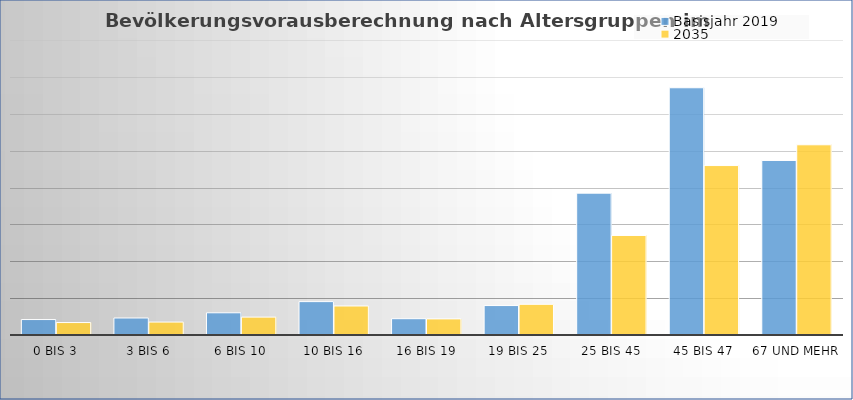
| Category | Basisjahr 2019 | 2035 |
|---|---|---|
| 0 bis 3 | 4187 | 3376 |
| 3 bis 6 | 4613 | 3508 |
| 6 bis 10 | 6023 | 4849 |
| 10 bis 16 | 9055 | 7869 |
| 16 bis 19 | 4422 | 4370 |
| 19 bis 25 | 7986 | 8324 |
| 25 bis 45 | 38462 | 26988 |
| 45 bis 47 | 67047 | 45951 |
| 67 und mehr | 47330 | 51583 |